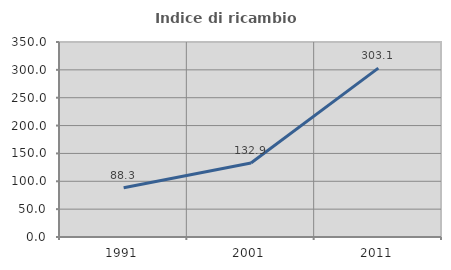
| Category | Indice di ricambio occupazionale  |
|---|---|
| 1991.0 | 88.277 |
| 2001.0 | 132.938 |
| 2011.0 | 303.096 |